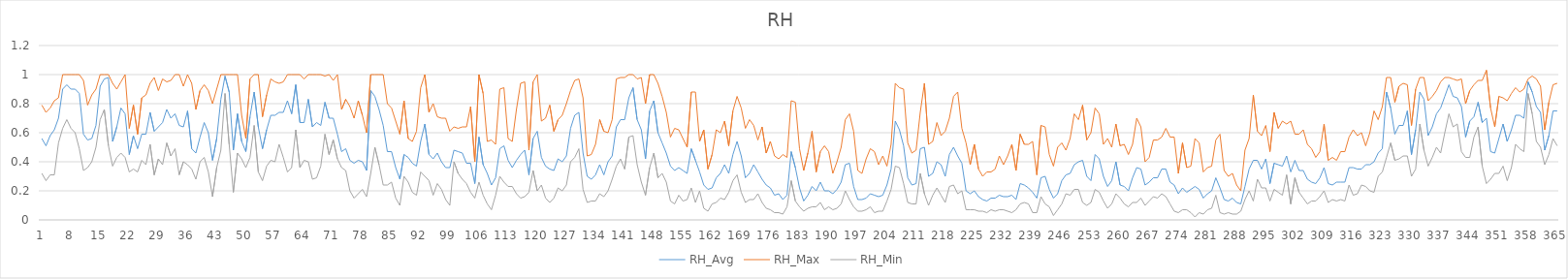
| Category | RH_Avg | RH_Max | RH_Min |
|---|---|---|---|
| 0 | 0.56 | 0.79 | 0.32 |
| 1 | 0.51 | 0.74 | 0.27 |
| 2 | 0.58 | 0.77 | 0.31 |
| 3 | 0.62 | 0.82 | 0.31 |
| 4 | 0.7 | 0.84 | 0.53 |
| 5 | 0.9 | 1 | 0.63 |
| 6 | 0.93 | 1 | 0.69 |
| 7 | 0.9 | 1 | 0.63 |
| 8 | 0.9 | 1 | 0.6 |
| 9 | 0.87 | 1 | 0.49 |
| 10 | 0.59 | 0.96 | 0.34 |
| 11 | 0.55 | 0.79 | 0.36 |
| 12 | 0.56 | 0.86 | 0.4 |
| 13 | 0.65 | 0.9 | 0.5 |
| 14 | 0.92 | 1 | 0.69 |
| 15 | 0.97 | 1 | 0.76 |
| 16 | 0.98 | 1 | 0.51 |
| 17 | 0.54 | 0.94 | 0.37 |
| 18 | 0.64 | 0.9 | 0.43 |
| 19 | 0.77 | 0.95 | 0.46 |
| 20 | 0.73 | 1 | 0.43 |
| 21 | 0.45 | 0.63 | 0.33 |
| 22 | 0.58 | 0.79 | 0.35 |
| 23 | 0.49 | 0.59 | 0.33 |
| 24 | 0.59 | 0.84 | 0.41 |
| 25 | 0.59 | 0.86 | 0.38 |
| 26 | 0.74 | 0.94 | 0.52 |
| 27 | 0.61 | 0.98 | 0.31 |
| 28 | 0.64 | 0.89 | 0.42 |
| 29 | 0.67 | 0.97 | 0.38 |
| 30 | 0.76 | 0.95 | 0.53 |
| 31 | 0.7 | 0.96 | 0.44 |
| 32 | 0.73 | 1 | 0.49 |
| 33 | 0.65 | 1 | 0.31 |
| 34 | 0.64 | 0.92 | 0.4 |
| 35 | 0.75 | 1 | 0.38 |
| 36 | 0.49 | 0.94 | 0.35 |
| 37 | 0.46 | 0.76 | 0.28 |
| 38 | 0.57 | 0.89 | 0.4 |
| 39 | 0.67 | 0.93 | 0.43 |
| 40 | 0.6 | 0.89 | 0.33 |
| 41 | 0.41 | 0.8 | 0.16 |
| 42 | 0.56 | 0.9 | 0.36 |
| 43 | 0.83 | 1 | 0.48 |
| 44 | 0.99 | 1 | 0.87 |
| 45 | 0.88 | 1 | 0.52 |
| 46 | 0.48 | 1 | 0.19 |
| 47 | 0.73 | 1 | 0.46 |
| 48 | 0.54 | 0.72 | 0.42 |
| 49 | 0.47 | 0.56 | 0.36 |
| 50 | 0.71 | 0.97 | 0.43 |
| 51 | 0.88 | 1 | 0.65 |
| 52 | 0.64 | 1 | 0.33 |
| 53 | 0.49 | 0.71 | 0.27 |
| 54 | 0.62 | 0.86 | 0.37 |
| 55 | 0.72 | 0.97 | 0.41 |
| 56 | 0.72 | 0.95 | 0.4 |
| 57 | 0.74 | 0.94 | 0.52 |
| 58 | 0.74 | 0.95 | 0.43 |
| 59 | 0.82 | 1 | 0.33 |
| 60 | 0.73 | 1 | 0.36 |
| 61 | 0.93 | 1 | 0.62 |
| 62 | 0.67 | 1 | 0.36 |
| 63 | 0.67 | 0.97 | 0.41 |
| 64 | 0.83 | 1 | 0.4 |
| 65 | 0.64 | 1 | 0.28 |
| 66 | 0.67 | 1 | 0.29 |
| 67 | 0.65 | 1 | 0.37 |
| 68 | 0.81 | 0.99 | 0.59 |
| 69 | 0.7 | 1 | 0.45 |
| 70 | 0.7 | 0.96 | 0.55 |
| 71 | 0.59 | 1 | 0.42 |
| 72 | 0.47 | 0.76 | 0.36 |
| 73 | 0.49 | 0.83 | 0.34 |
| 74 | 0.41 | 0.78 | 0.2 |
| 75 | 0.39 | 0.7 | 0.15 |
| 76 | 0.41 | 0.82 | 0.18 |
| 77 | 0.4 | 0.72 | 0.21 |
| 78 | 0.34 | 0.6 | 0.16 |
| 79 | 0.89 | 1 | 0.32 |
| 80 | 0.85 | 1 | 0.5 |
| 81 | 0.76 | 1 | 0.38 |
| 82 | 0.65 | 1 | 0.24 |
| 83 | 0.47 | 0.8 | 0.24 |
| 84 | 0.47 | 0.77 | 0.26 |
| 85 | 0.36 | 0.68 | 0.15 |
| 86 | 0.28 | 0.59 | 0.1 |
| 87 | 0.45 | 0.82 | 0.3 |
| 88 | 0.43 | 0.56 | 0.26 |
| 89 | 0.39 | 0.54 | 0.19 |
| 90 | 0.37 | 0.61 | 0.17 |
| 91 | 0.54 | 0.91 | 0.33 |
| 92 | 0.66 | 1 | 0.3 |
| 93 | 0.45 | 0.74 | 0.27 |
| 94 | 0.42 | 0.8 | 0.17 |
| 95 | 0.46 | 0.71 | 0.25 |
| 96 | 0.4 | 0.7 | 0.21 |
| 97 | 0.36 | 0.7 | 0.14 |
| 98 | 0.36 | 0.61 | 0.1 |
| 99 | 0.48 | 0.64 | 0.4 |
| 100 | 0.47 | 0.63 | 0.32 |
| 101 | 0.46 | 0.64 | 0.28 |
| 102 | 0.39 | 0.64 | 0.25 |
| 103 | 0.39 | 0.78 | 0.19 |
| 104 | 0.25 | 0.4 | 0.15 |
| 105 | 0.57 | 1 | 0.26 |
| 106 | 0.38 | 0.87 | 0.17 |
| 107 | 0.32 | 0.54 | 0.11 |
| 108 | 0.24 | 0.55 | 0.07 |
| 109 | 0.29 | 0.52 | 0.17 |
| 110 | 0.49 | 0.9 | 0.3 |
| 111 | 0.51 | 0.91 | 0.26 |
| 112 | 0.41 | 0.56 | 0.23 |
| 113 | 0.36 | 0.54 | 0.23 |
| 114 | 0.41 | 0.76 | 0.18 |
| 115 | 0.45 | 0.94 | 0.15 |
| 116 | 0.48 | 0.95 | 0.16 |
| 117 | 0.31 | 0.48 | 0.19 |
| 118 | 0.56 | 0.95 | 0.34 |
| 119 | 0.61 | 1 | 0.2 |
| 120 | 0.43 | 0.68 | 0.24 |
| 121 | 0.37 | 0.7 | 0.15 |
| 122 | 0.35 | 0.79 | 0.12 |
| 123 | 0.34 | 0.61 | 0.15 |
| 124 | 0.42 | 0.69 | 0.22 |
| 125 | 0.4 | 0.72 | 0.2 |
| 126 | 0.44 | 0.8 | 0.24 |
| 127 | 0.63 | 0.89 | 0.4 |
| 128 | 0.72 | 0.96 | 0.43 |
| 129 | 0.74 | 0.97 | 0.49 |
| 130 | 0.46 | 0.84 | 0.21 |
| 131 | 0.3 | 0.44 | 0.12 |
| 132 | 0.28 | 0.45 | 0.13 |
| 133 | 0.31 | 0.52 | 0.13 |
| 134 | 0.38 | 0.69 | 0.18 |
| 135 | 0.31 | 0.61 | 0.16 |
| 136 | 0.4 | 0.6 | 0.2 |
| 137 | 0.44 | 0.69 | 0.28 |
| 138 | 0.64 | 0.97 | 0.37 |
| 139 | 0.69 | 0.98 | 0.42 |
| 140 | 0.69 | 0.98 | 0.35 |
| 141 | 0.84 | 1 | 0.57 |
| 142 | 0.91 | 1 | 0.58 |
| 143 | 0.69 | 0.97 | 0.38 |
| 144 | 0.62 | 0.98 | 0.26 |
| 145 | 0.42 | 0.8 | 0.17 |
| 146 | 0.75 | 1 | 0.36 |
| 147 | 0.82 | 1 | 0.46 |
| 148 | 0.6 | 0.94 | 0.29 |
| 149 | 0.53 | 0.85 | 0.32 |
| 150 | 0.46 | 0.74 | 0.26 |
| 151 | 0.37 | 0.57 | 0.13 |
| 152 | 0.34 | 0.63 | 0.11 |
| 153 | 0.36 | 0.62 | 0.17 |
| 154 | 0.34 | 0.56 | 0.13 |
| 155 | 0.32 | 0.5 | 0.14 |
| 156 | 0.49 | 0.88 | 0.22 |
| 157 | 0.41 | 0.88 | 0.12 |
| 158 | 0.33 | 0.54 | 0.2 |
| 159 | 0.24 | 0.62 | 0.08 |
| 160 | 0.21 | 0.35 | 0.06 |
| 161 | 0.22 | 0.45 | 0.11 |
| 162 | 0.29 | 0.62 | 0.12 |
| 163 | 0.32 | 0.6 | 0.15 |
| 164 | 0.38 | 0.68 | 0.14 |
| 165 | 0.32 | 0.51 | 0.19 |
| 166 | 0.45 | 0.75 | 0.27 |
| 167 | 0.54 | 0.85 | 0.31 |
| 168 | 0.44 | 0.77 | 0.19 |
| 169 | 0.29 | 0.63 | 0.12 |
| 170 | 0.32 | 0.69 | 0.14 |
| 171 | 0.38 | 0.65 | 0.14 |
| 172 | 0.33 | 0.55 | 0.18 |
| 173 | 0.28 | 0.64 | 0.12 |
| 174 | 0.24 | 0.46 | 0.08 |
| 175 | 0.22 | 0.54 | 0.07 |
| 176 | 0.17 | 0.44 | 0.05 |
| 177 | 0.18 | 0.42 | 0.05 |
| 178 | 0.14 | 0.45 | 0.04 |
| 179 | 0.17 | 0.43 | 0.09 |
| 180 | 0.47 | 0.82 | 0.27 |
| 181 | 0.36 | 0.81 | 0.13 |
| 182 | 0.22 | 0.49 | 0.09 |
| 183 | 0.13 | 0.34 | 0.06 |
| 184 | 0.17 | 0.46 | 0.08 |
| 185 | 0.23 | 0.61 | 0.09 |
| 186 | 0.2 | 0.33 | 0.09 |
| 187 | 0.26 | 0.47 | 0.12 |
| 188 | 0.2 | 0.51 | 0.07 |
| 189 | 0.2 | 0.47 | 0.09 |
| 190 | 0.18 | 0.32 | 0.07 |
| 191 | 0.21 | 0.4 | 0.08 |
| 192 | 0.26 | 0.5 | 0.11 |
| 193 | 0.38 | 0.69 | 0.2 |
| 194 | 0.39 | 0.73 | 0.14 |
| 195 | 0.23 | 0.61 | 0.09 |
| 196 | 0.14 | 0.34 | 0.06 |
| 197 | 0.14 | 0.32 | 0.06 |
| 198 | 0.15 | 0.42 | 0.07 |
| 199 | 0.18 | 0.49 | 0.09 |
| 200 | 0.17 | 0.47 | 0.05 |
| 201 | 0.16 | 0.38 | 0.06 |
| 202 | 0.17 | 0.44 | 0.06 |
| 203 | 0.24 | 0.37 | 0.13 |
| 204 | 0.35 | 0.52 | 0.21 |
| 205 | 0.68 | 0.94 | 0.37 |
| 206 | 0.62 | 0.91 | 0.36 |
| 207 | 0.51 | 0.9 | 0.25 |
| 208 | 0.29 | 0.53 | 0.12 |
| 209 | 0.24 | 0.46 | 0.11 |
| 210 | 0.25 | 0.48 | 0.11 |
| 211 | 0.49 | 0.74 | 0.32 |
| 212 | 0.5 | 0.94 | 0.18 |
| 213 | 0.3 | 0.52 | 0.1 |
| 214 | 0.32 | 0.54 | 0.17 |
| 215 | 0.4 | 0.67 | 0.22 |
| 216 | 0.38 | 0.58 | 0.17 |
| 217 | 0.3 | 0.61 | 0.12 |
| 218 | 0.45 | 0.7 | 0.23 |
| 219 | 0.5 | 0.85 | 0.24 |
| 220 | 0.44 | 0.88 | 0.18 |
| 221 | 0.39 | 0.63 | 0.2 |
| 222 | 0.2 | 0.53 | 0.07 |
| 223 | 0.18 | 0.38 | 0.07 |
| 224 | 0.2 | 0.52 | 0.07 |
| 225 | 0.16 | 0.35 | 0.06 |
| 226 | 0.14 | 0.3 | 0.06 |
| 227 | 0.13 | 0.33 | 0.05 |
| 228 | 0.15 | 0.33 | 0.07 |
| 229 | 0.15 | 0.35 | 0.06 |
| 230 | 0.17 | 0.44 | 0.07 |
| 231 | 0.16 | 0.38 | 0.07 |
| 232 | 0.16 | 0.44 | 0.06 |
| 233 | 0.17 | 0.52 | 0.05 |
| 234 | 0.14 | 0.34 | 0.07 |
| 235 | 0.25 | 0.59 | 0.11 |
| 236 | 0.24 | 0.52 | 0.12 |
| 237 | 0.22 | 0.52 | 0.11 |
| 238 | 0.19 | 0.54 | 0.05 |
| 239 | 0.15 | 0.31 | 0.05 |
| 240 | 0.29 | 0.65 | 0.16 |
| 241 | 0.3 | 0.64 | 0.11 |
| 242 | 0.21 | 0.45 | 0.09 |
| 243 | 0.15 | 0.37 | 0.03 |
| 244 | 0.18 | 0.5 | 0.07 |
| 245 | 0.27 | 0.53 | 0.11 |
| 246 | 0.31 | 0.48 | 0.18 |
| 247 | 0.32 | 0.56 | 0.17 |
| 248 | 0.38 | 0.73 | 0.21 |
| 249 | 0.4 | 0.69 | 0.21 |
| 250 | 0.41 | 0.79 | 0.12 |
| 251 | 0.3 | 0.55 | 0.1 |
| 252 | 0.27 | 0.6 | 0.12 |
| 253 | 0.45 | 0.77 | 0.21 |
| 254 | 0.42 | 0.73 | 0.19 |
| 255 | 0.3 | 0.52 | 0.13 |
| 256 | 0.23 | 0.56 | 0.08 |
| 257 | 0.27 | 0.5 | 0.11 |
| 258 | 0.4 | 0.66 | 0.18 |
| 259 | 0.24 | 0.51 | 0.15 |
| 260 | 0.23 | 0.52 | 0.11 |
| 261 | 0.2 | 0.45 | 0.09 |
| 262 | 0.29 | 0.52 | 0.12 |
| 263 | 0.36 | 0.7 | 0.12 |
| 264 | 0.35 | 0.64 | 0.15 |
| 265 | 0.24 | 0.4 | 0.1 |
| 266 | 0.26 | 0.43 | 0.13 |
| 267 | 0.29 | 0.55 | 0.16 |
| 268 | 0.29 | 0.55 | 0.15 |
| 269 | 0.35 | 0.57 | 0.18 |
| 270 | 0.35 | 0.63 | 0.16 |
| 271 | 0.26 | 0.57 | 0.11 |
| 272 | 0.24 | 0.57 | 0.06 |
| 273 | 0.18 | 0.32 | 0.05 |
| 274 | 0.22 | 0.53 | 0.07 |
| 275 | 0.19 | 0.36 | 0.07 |
| 276 | 0.21 | 0.37 | 0.05 |
| 277 | 0.23 | 0.56 | 0.02 |
| 278 | 0.21 | 0.53 | 0.05 |
| 279 | 0.15 | 0.33 | 0.04 |
| 280 | 0.18 | 0.36 | 0.07 |
| 281 | 0.2 | 0.37 | 0.08 |
| 282 | 0.29 | 0.55 | 0.17 |
| 283 | 0.22 | 0.59 | 0.05 |
| 284 | 0.14 | 0.34 | 0.04 |
| 285 | 0.13 | 0.3 | 0.05 |
| 286 | 0.15 | 0.32 | 0.04 |
| 287 | 0.12 | 0.24 | 0.04 |
| 288 | 0.11 | 0.2 | 0.06 |
| 289 | 0.23 | 0.48 | 0.14 |
| 290 | 0.35 | 0.56 | 0.2 |
| 291 | 0.41 | 0.86 | 0.13 |
| 292 | 0.41 | 0.61 | 0.28 |
| 293 | 0.35 | 0.58 | 0.22 |
| 294 | 0.42 | 0.65 | 0.22 |
| 295 | 0.25 | 0.47 | 0.13 |
| 296 | 0.39 | 0.74 | 0.21 |
| 297 | 0.38 | 0.63 | 0.19 |
| 298 | 0.37 | 0.68 | 0.17 |
| 299 | 0.44 | 0.66 | 0.31 |
| 300 | 0.33 | 0.68 | 0.11 |
| 301 | 0.41 | 0.59 | 0.29 |
| 302 | 0.34 | 0.59 | 0.19 |
| 303 | 0.34 | 0.62 | 0.15 |
| 304 | 0.28 | 0.52 | 0.11 |
| 305 | 0.26 | 0.49 | 0.13 |
| 306 | 0.25 | 0.43 | 0.13 |
| 307 | 0.29 | 0.47 | 0.16 |
| 308 | 0.36 | 0.66 | 0.2 |
| 309 | 0.25 | 0.41 | 0.12 |
| 310 | 0.24 | 0.43 | 0.14 |
| 311 | 0.26 | 0.41 | 0.13 |
| 312 | 0.26 | 0.47 | 0.14 |
| 313 | 0.26 | 0.47 | 0.13 |
| 314 | 0.36 | 0.57 | 0.24 |
| 315 | 0.36 | 0.62 | 0.17 |
| 316 | 0.35 | 0.58 | 0.18 |
| 317 | 0.35 | 0.6 | 0.24 |
| 318 | 0.38 | 0.51 | 0.23 |
| 319 | 0.38 | 0.6 | 0.2 |
| 320 | 0.4 | 0.75 | 0.19 |
| 321 | 0.46 | 0.69 | 0.3 |
| 322 | 0.49 | 0.78 | 0.33 |
| 323 | 0.88 | 0.98 | 0.43 |
| 324 | 0.77 | 0.98 | 0.53 |
| 325 | 0.59 | 0.81 | 0.41 |
| 326 | 0.65 | 0.92 | 0.42 |
| 327 | 0.65 | 0.94 | 0.44 |
| 328 | 0.75 | 0.93 | 0.44 |
| 329 | 0.45 | 0.65 | 0.3 |
| 330 | 0.62 | 0.9 | 0.35 |
| 331 | 0.88 | 0.98 | 0.66 |
| 332 | 0.83 | 0.98 | 0.48 |
| 333 | 0.58 | 0.82 | 0.37 |
| 334 | 0.64 | 0.85 | 0.43 |
| 335 | 0.73 | 0.89 | 0.5 |
| 336 | 0.77 | 0.95 | 0.46 |
| 337 | 0.85 | 0.98 | 0.6 |
| 338 | 0.93 | 0.98 | 0.73 |
| 339 | 0.85 | 0.97 | 0.64 |
| 340 | 0.84 | 0.96 | 0.66 |
| 341 | 0.78 | 0.97 | 0.47 |
| 342 | 0.57 | 0.8 | 0.43 |
| 343 | 0.68 | 0.89 | 0.43 |
| 344 | 0.71 | 0.93 | 0.57 |
| 345 | 0.81 | 0.96 | 0.64 |
| 346 | 0.67 | 0.96 | 0.37 |
| 347 | 0.7 | 1.03 | 0.25 |
| 348 | 0.47 | 0.77 | 0.28 |
| 349 | 0.46 | 0.64 | 0.32 |
| 350 | 0.56 | 0.85 | 0.32 |
| 351 | 0.66 | 0.84 | 0.37 |
| 352 | 0.54 | 0.82 | 0.27 |
| 353 | 0.62 | 0.87 | 0.36 |
| 354 | 0.72 | 0.91 | 0.52 |
| 355 | 0.72 | 0.88 | 0.49 |
| 356 | 0.7 | 0.9 | 0.47 |
| 357 | 0.95 | 0.97 | 0.87 |
| 358 | 0.88 | 0.99 | 0.73 |
| 359 | 0.78 | 0.97 | 0.54 |
| 360 | 0.74 | 0.92 | 0.5 |
| 361 | 0.48 | 0.62 | 0.38 |
| 362 | 0.58 | 0.81 | 0.45 |
| 363 | 0.75 | 0.93 | 0.56 |
| 364 | 0.75 | 0.94 | 0.51 |